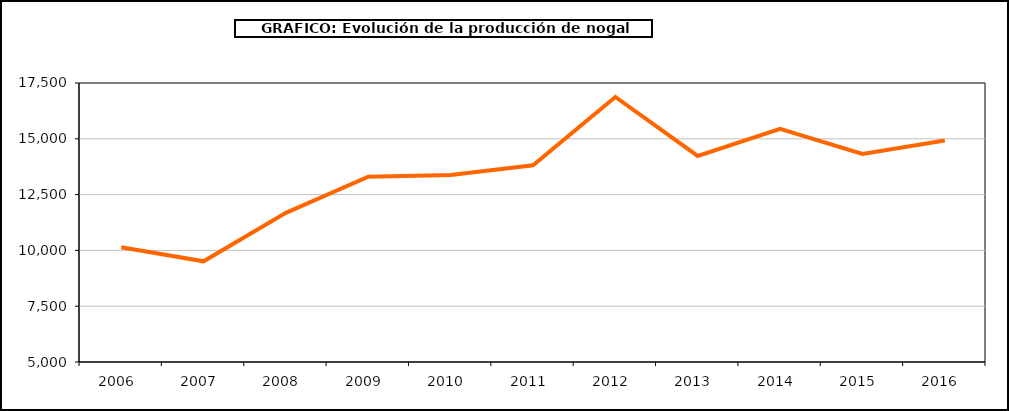
| Category | producción nogal |
|---|---|
| 2006.0 | 10140 |
| 2007.0 | 9512 |
| 2008.0 | 11682 |
| 2009.0 | 13299 |
| 2010.0 | 13378 |
| 2011.0 | 13815 |
| 2012.0 | 16877 |
| 2013.0 | 14230 |
| 2014.0 | 15450 |
| 2015.0 | 14319 |
| 2016.0 | 14923 |